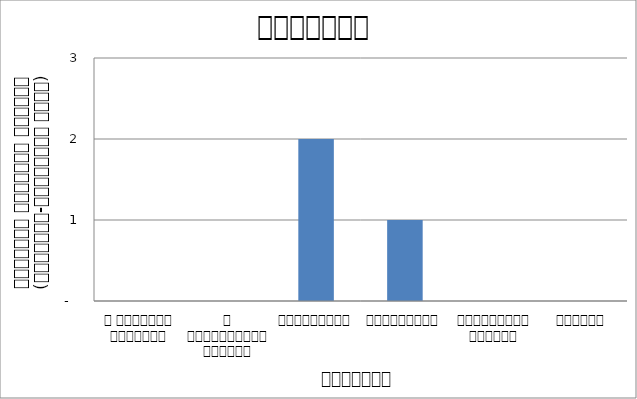
| Category | वातावरण |
|---|---|
| द हिमालयन टाइम्स् | 0 |
| द काठमाण्डौं पोस्ट् | 0 |
| रिपब्लिका | 2 |
| कान्तिपुर | 1 |
| अन्नपूर्ण पोस्ट् | 0 |
| नागरिक | 0 |